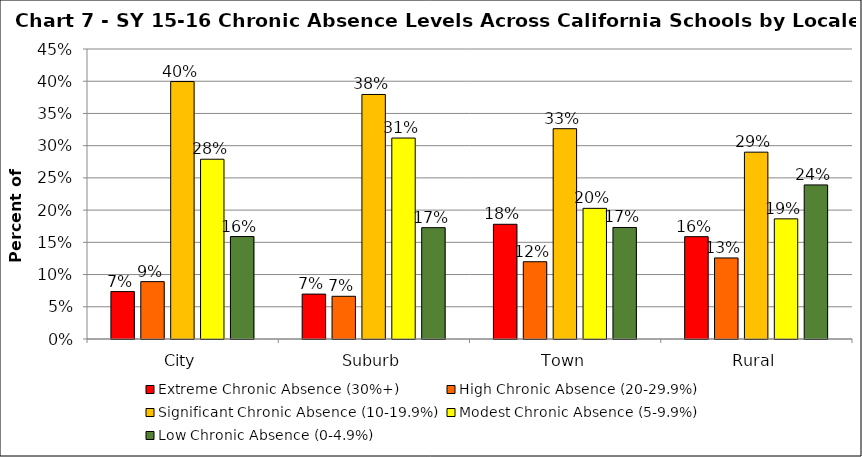
| Category | Extreme Chronic Absence (30%+) | High Chronic Absence (20-29.9%) | Significant Chronic Absence (10-19.9%) | Modest Chronic Absence (5-9.9%) | Low Chronic Absence (0-4.9%) |
|---|---|---|---|---|---|
| 0 | 0.074 | 0.089 | 0.4 | 0.279 | 0.159 |
| 1 | 0.07 | 0.066 | 0.379 | 0.312 | 0.173 |
| 2 | 0.178 | 0.12 | 0.326 | 0.203 | 0.173 |
| 3 | 0.159 | 0.126 | 0.29 | 0.186 | 0.239 |